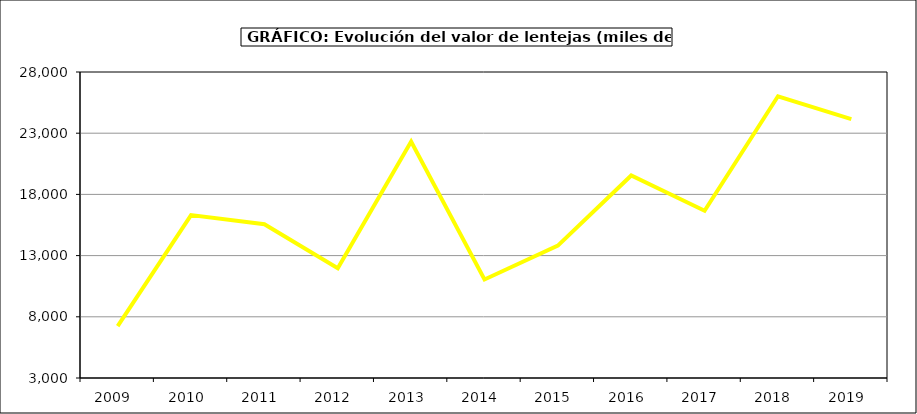
| Category | Valor |
|---|---|
| 2009.0 | 7234.01 |
| 2010.0 | 16307.099 |
| 2011.0 | 15562.569 |
| 2012.0 | 11960.065 |
| 2013.0 | 22313.5 |
| 2014.0 | 11051.282 |
| 2015.0 | 13811 |
| 2016.0 | 19549 |
| 2017.0 | 16662.624 |
| 2018.0 | 26017.402 |
| 2019.0 | 24153.639 |